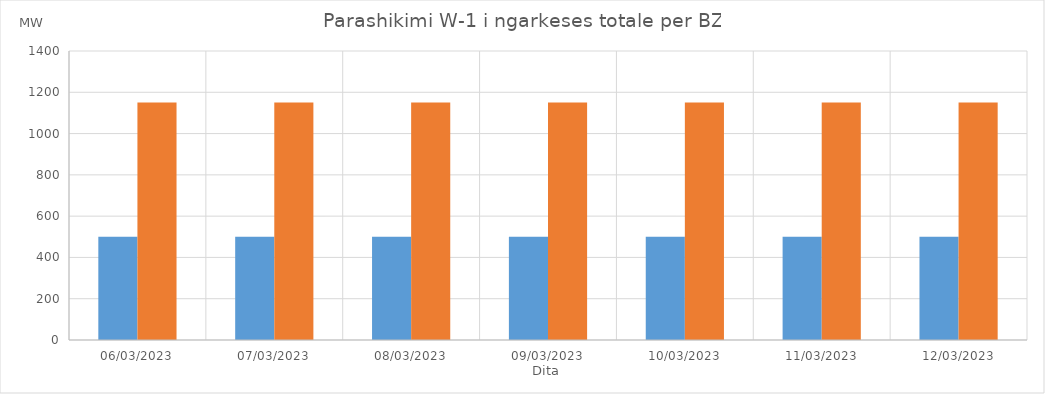
| Category | Min (MW) | Max (MW) |
|---|---|---|
| 06/03/2023 | 500 | 1150 |
| 07/03/2023 | 500 | 1150 |
| 08/03/2023 | 500 | 1150 |
| 09/03/2023 | 500 | 1150 |
| 10/03/2023 | 500 | 1150 |
| 11/03/2023 | 500 | 1150 |
| 12/03/2023 | 500 | 1150 |